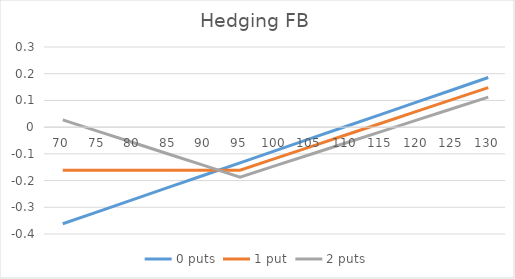
| Category | 0 puts | 1 put | 2 puts |
|---|---|---|---|
| 70.0 | -0.362 | -0.161 | 0.027 |
| 75.0 | -0.316 | -0.161 | -0.016 |
| 80.0 | -0.27 | -0.161 | -0.059 |
| 85.0 | -0.225 | -0.161 | -0.101 |
| 90.0 | -0.179 | -0.161 | -0.144 |
| 95.0 | -0.134 | -0.161 | -0.187 |
| 100.0 | -0.088 | -0.117 | -0.144 |
| 105.0 | -0.042 | -0.073 | -0.101 |
| 110.0 | 0.003 | -0.029 | -0.059 |
| 115.0 | 0.049 | 0.016 | -0.016 |
| 120.0 | 0.094 | 0.06 | 0.027 |
| 125.0 | 0.14 | 0.104 | 0.07 |
| 130.0 | 0.186 | 0.148 | 0.113 |